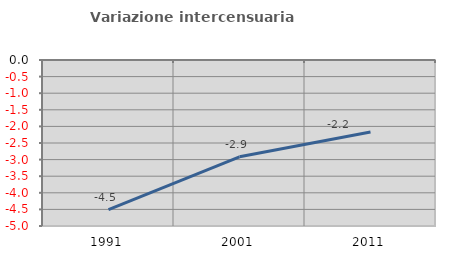
| Category | Variazione intercensuaria annua |
|---|---|
| 1991.0 | -4.504 |
| 2001.0 | -2.915 |
| 2011.0 | -2.167 |